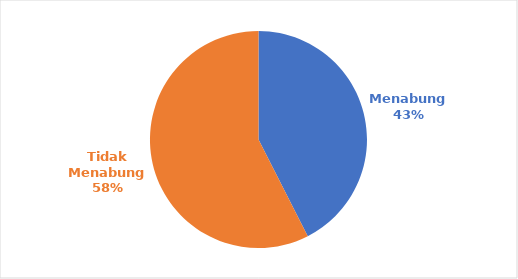
| Category | Indikator Saving Ratio |
|---|---|
| Menabung  | 17 |
| Tidak Menabung  | 23 |